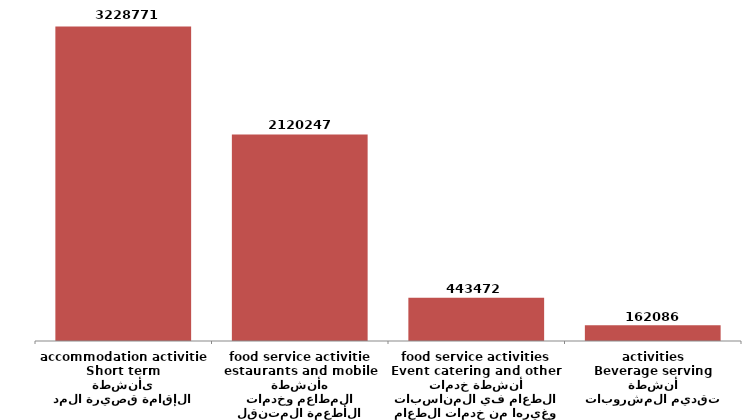
| Category | Series 0 |
|---|---|
| أنشطة الإقامة قصيرة المدى
Short term accommodation activities | 3228771 |
| أنشطة المطاعم وخدمات الأطعمة المتنقله
estaurants and mobile food service activities | 2120247 |
| أنشطة خدمات الطعام في المناسبات وغيرها من خدمات الطعام
Event catering and other food service activities | 443472 |
| أنشطة تقديم المشروبات
Beverage serving activities | 162086 |